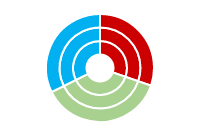
| Category | Series 1 | Series 2 | Series 0 |
|---|---|---|---|
| Frequent | 0.3 | 0.3 | 0.3 |
| Moderate | 0.37 | 0.37 | 0.37 |
| Infrequent | 0.32 | 0.32 | 0.32 |